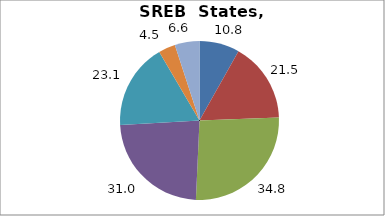
| Category | Series 0 |
|---|---|
| Higher Education | 10.785 |
| Elementary and Secondary Education | 21.516 |
| Total Education1 | 34.807 |
| Social Welfare2 | 30.952 |
| Transportation, Public Safety, Environment and Housing3 | 23.064 |
| Administration | 4.535 |
| Other4 | 6.637 |